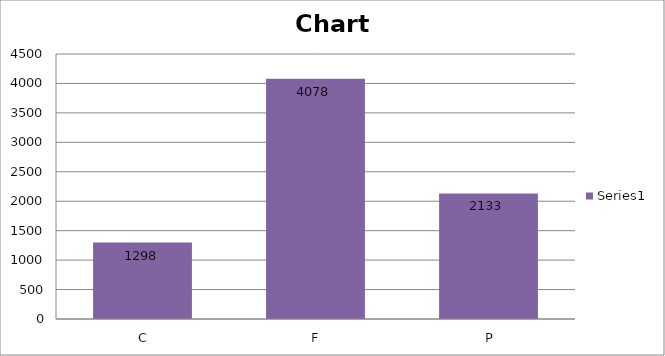
| Category | Series 0 |
|---|---|
|  C | 1298 |
|  F | 4078 |
|  P | 2133 |